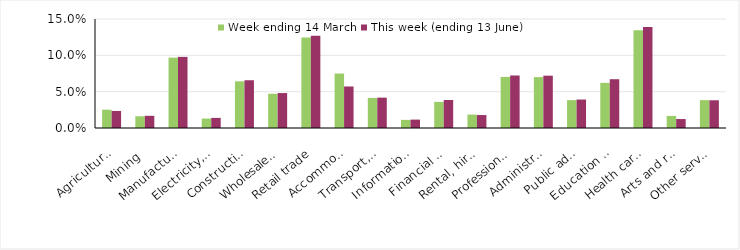
| Category | Week ending 14 March | This week (ending 13 June) |
|---|---|---|
| Agriculture, forestry and fishing | 0.025 | 0.023 |
| Mining | 0.016 | 0.017 |
| Manufacturing | 0.097 | 0.098 |
| Electricity, gas, water and waste services | 0.013 | 0.014 |
| Construction | 0.064 | 0.066 |
| Wholesale trade | 0.047 | 0.048 |
| Retail trade | 0.125 | 0.127 |
| Accommodation and food services | 0.075 | 0.057 |
| Transport, postal and warehousing | 0.041 | 0.042 |
| Information media and telecommunications | 0.011 | 0.012 |
| Financial and insurance services | 0.036 | 0.039 |
| Rental, hiring and real estate services | 0.018 | 0.018 |
| Professional, scientific and technical services | 0.07 | 0.072 |
| Administrative and support services | 0.07 | 0.072 |
| Public administration and safety | 0.038 | 0.039 |
| Education and training | 0.062 | 0.067 |
| Health care and social assistance | 0.135 | 0.139 |
| Arts and recreation services | 0.017 | 0.012 |
| Other services | 0.038 | 0.038 |